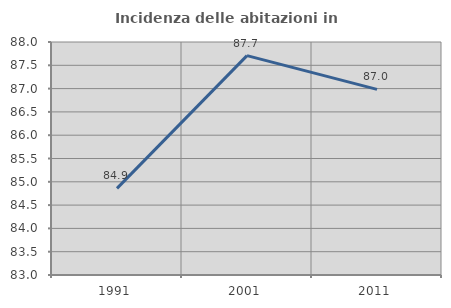
| Category | Incidenza delle abitazioni in proprietà  |
|---|---|
| 1991.0 | 84.86 |
| 2001.0 | 87.709 |
| 2011.0 | 86.984 |